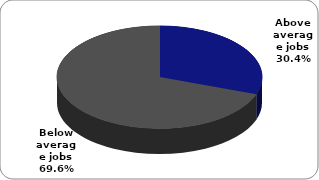
| Category | Series 0 |
|---|---|
| Above average jobs | 0.304 |
| Below average jobs | 0.696 |